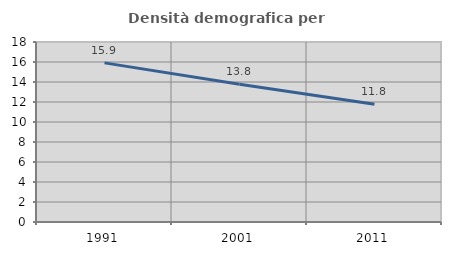
| Category | Densità demografica |
|---|---|
| 1991.0 | 15.913 |
| 2001.0 | 13.777 |
| 2011.0 | 11.771 |